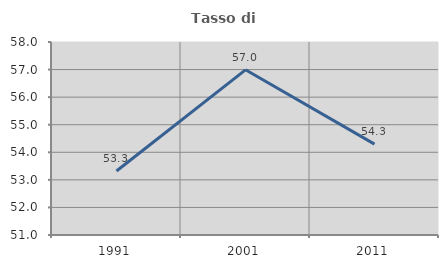
| Category | Tasso di occupazione   |
|---|---|
| 1991.0 | 53.32 |
| 2001.0 | 56.991 |
| 2011.0 | 54.297 |